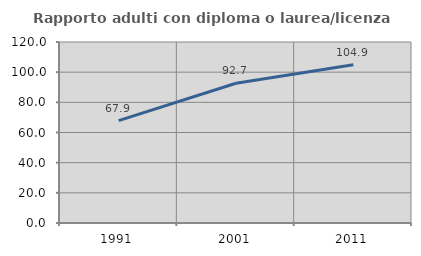
| Category | Rapporto adulti con diploma o laurea/licenza media  |
|---|---|
| 1991.0 | 67.901 |
| 2001.0 | 92.661 |
| 2011.0 | 104.918 |